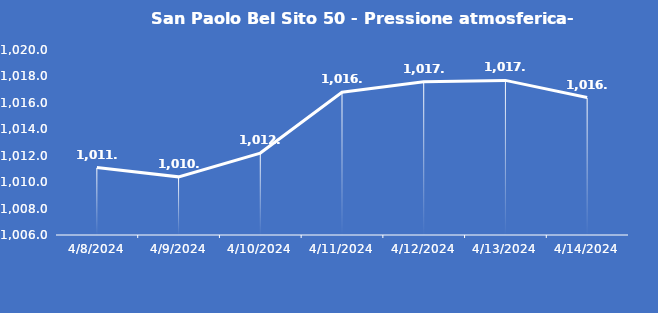
| Category | San Paolo Bel Sito 50 - Pressione atmosferica- Grezzo (hPa) |
|---|---|
| 4/8/24 | 1011.1 |
| 4/9/24 | 1010.4 |
| 4/10/24 | 1012.2 |
| 4/11/24 | 1016.8 |
| 4/12/24 | 1017.6 |
| 4/13/24 | 1017.7 |
| 4/14/24 | 1016.4 |